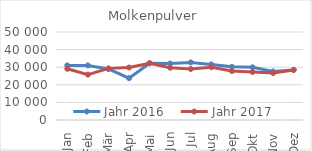
| Category | Jahr 2016 | Jahr 2017 |
|---|---|---|
| Jan | 31032.313 | 29081.026 |
| Feb | 31016.668 | 25798.067 |
| Mär | 28975.31 | 29334.741 |
| Apr | 23766.593 | 29834.498 |
| Mai | 32256.298 | 32290.45 |
| Jun | 32101.795 | 29693.143 |
| Jul | 32736.218 | 28967.059 |
| Aug | 31599.869 | 29967.023 |
| Sep | 30208.927 | 27798.038 |
| Okt | 29928.514 | 27280.591 |
| Nov | 27596.373 | 26664.264 |
| Dez | 28479.872 | 28456.555 |